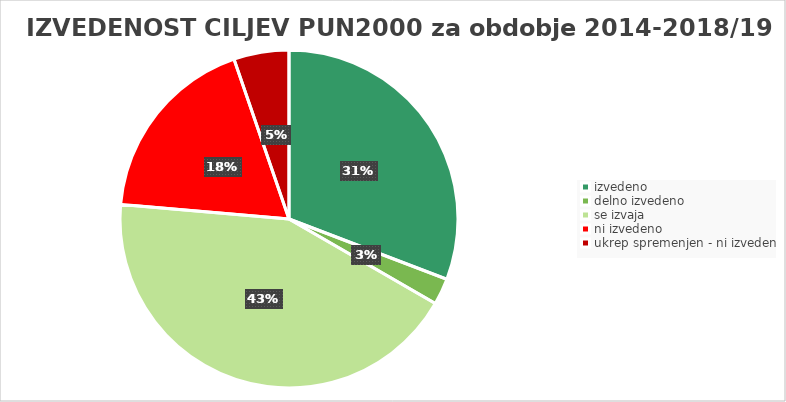
| Category | Series 0 |
|---|---|
| izvedeno | 0.308 |
| delno izvedeno | 0.025 |
| se izvaja | 0.43 |
| ni izvedeno | 0.184 |
| ukrep spremenjen - ni izveden | 0.053 |